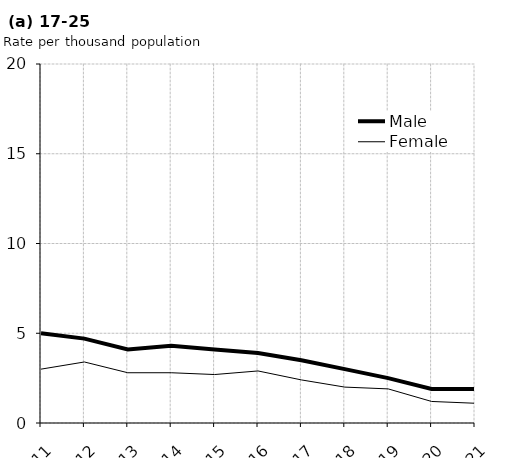
| Category | Male | Female |
|---|---|---|
| 2011.0 | 5 | 3 |
| 2012.0 | 4.7 | 3.4 |
| 2013.0 | 4.1 | 2.8 |
| 2014.0 | 4.3 | 2.8 |
| 2015.0 | 4.1 | 2.7 |
| 2016.0 | 3.9 | 2.9 |
| 2017.0 | 3.5 | 2.4 |
| 2018.0 | 3 | 2 |
| 2019.0 | 2.5 | 1.9 |
| 2020.0 | 1.9 | 1.2 |
| 2021.0 | 1.9 | 1.1 |